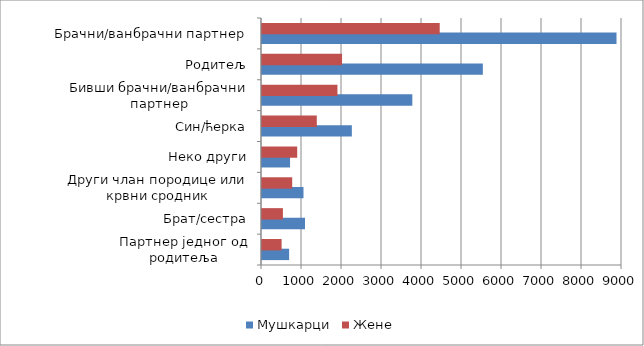
| Category | Мушкарци | Жене |
|---|---|---|
| Партнер једног од родитеља | 678 | 490 |
| Брат/сестра | 1075 | 523 |
| Други члан породице или крвни сродник | 1037 | 755 |
| Неко други | 701 | 880 |
| Син/ћерка | 2246 | 1370 |
| Бивши брачни/ванбрачни партнер | 3758 | 1886 |
| Родитељ | 5521 | 2001 |
| Брачни/ванбрачни партнер | 8863 | 4443 |